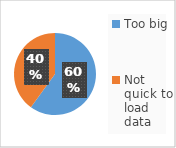
| Category | Series 0 |
|---|---|
| Too big | 3 |
| Not quick to load data | 2 |